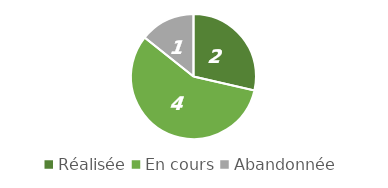
| Category | Series 0 |
|---|---|
| Réalisée | 2 |
| En cours | 4 |
| Abandonnée | 1 |